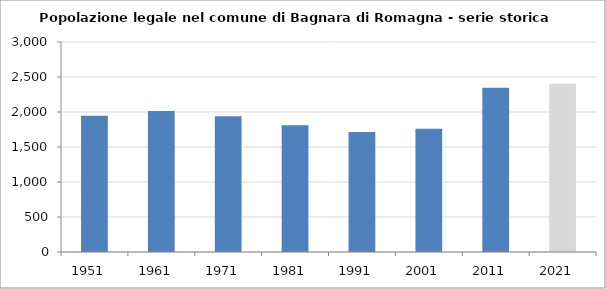
| Category | Popolazione residente |
|---|---|
| 1951   | 1947 |
| 1961   | 2015 |
| 1971   | 1941 |
| 1981   | 1810 |
| 1991   | 1713 |
| 2001   | 1761 |
| 2011   | 2348 |
| 2021   | 2405 |